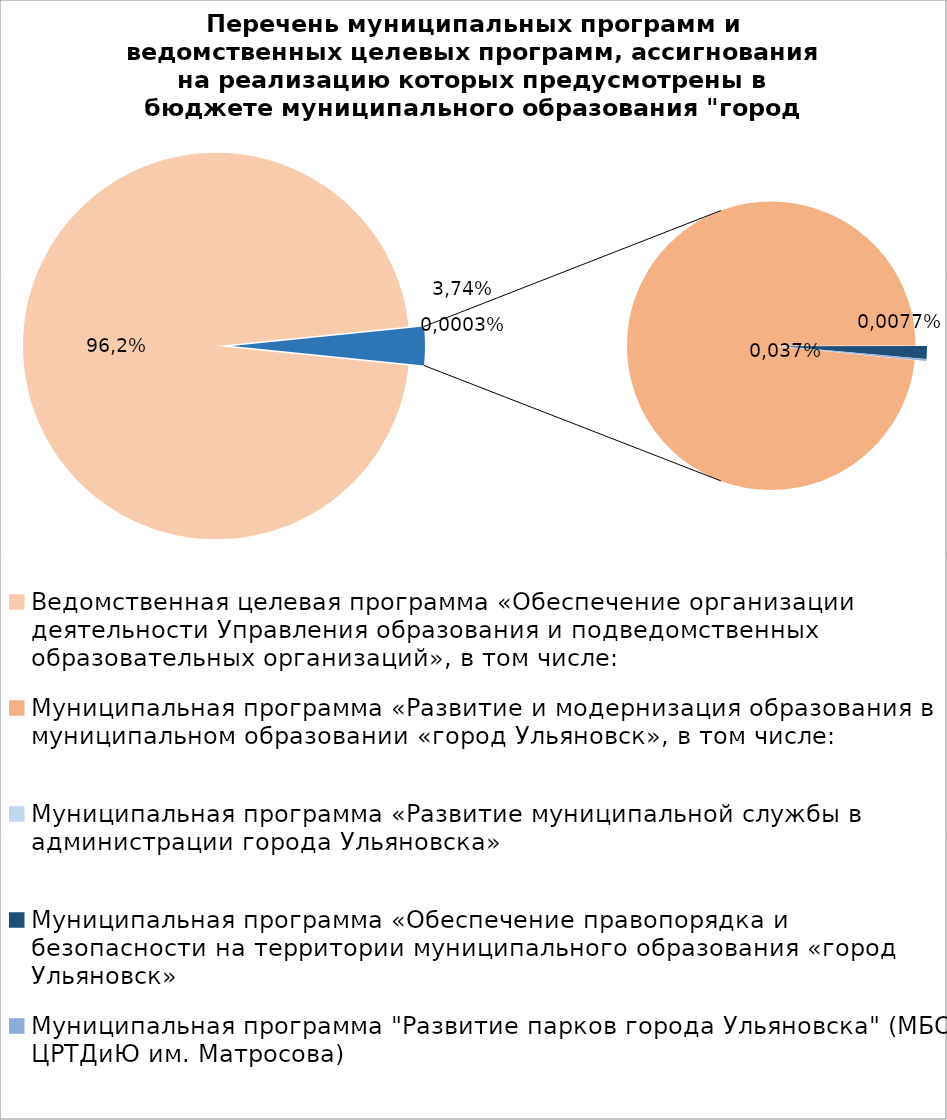
| Category | Series 0 |
|---|---|
| Ведомственная целевая программа «Обеспечение организации деятельности Управления образования и подведомственных образовательных организаций», в том числе: | 5732823.29 |
| Муниципальная программа «Развитие и модернизация образования в муниципальном образовании «город Ульяновск», в том числе: | 187433.06 |
| Муниципальная программа «Развитие муниципальной службы в администрации города Ульяновска» | 15.4 |
| Муниципальная программа «Обеспечение правопорядка и безопасности на территории муниципального образования «город Ульяновск» | 2700 |
| Муниципальная программа "Развитие парков города Ульяновска" (МБОУ ЦРТДиЮ им. Матросова) | 400 |